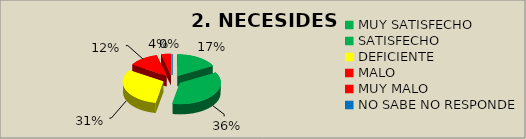
| Category | 2. NECESIDES TECNOLÓGICAS |
|---|---|
| MUY SATISFECHO | 0.17 |
| SATISFECHO | 0.36 |
| DEFICIENTE | 0.31 |
| MALO | 0.12 |
| MUY MALO | 0.04 |
| NO SABE NO RESPONDE | 0 |